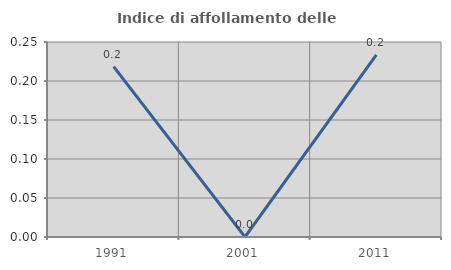
| Category | Indice di affollamento delle abitazioni  |
|---|---|
| 1991.0 | 0.218 |
| 2001.0 | 0 |
| 2011.0 | 0.234 |